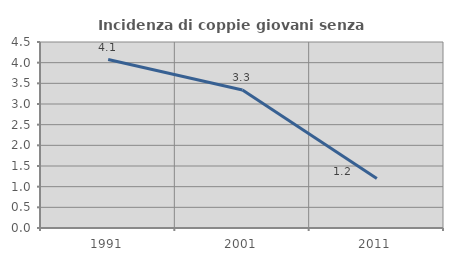
| Category | Incidenza di coppie giovani senza figli |
|---|---|
| 1991.0 | 4.075 |
| 2001.0 | 3.34 |
| 2011.0 | 1.199 |